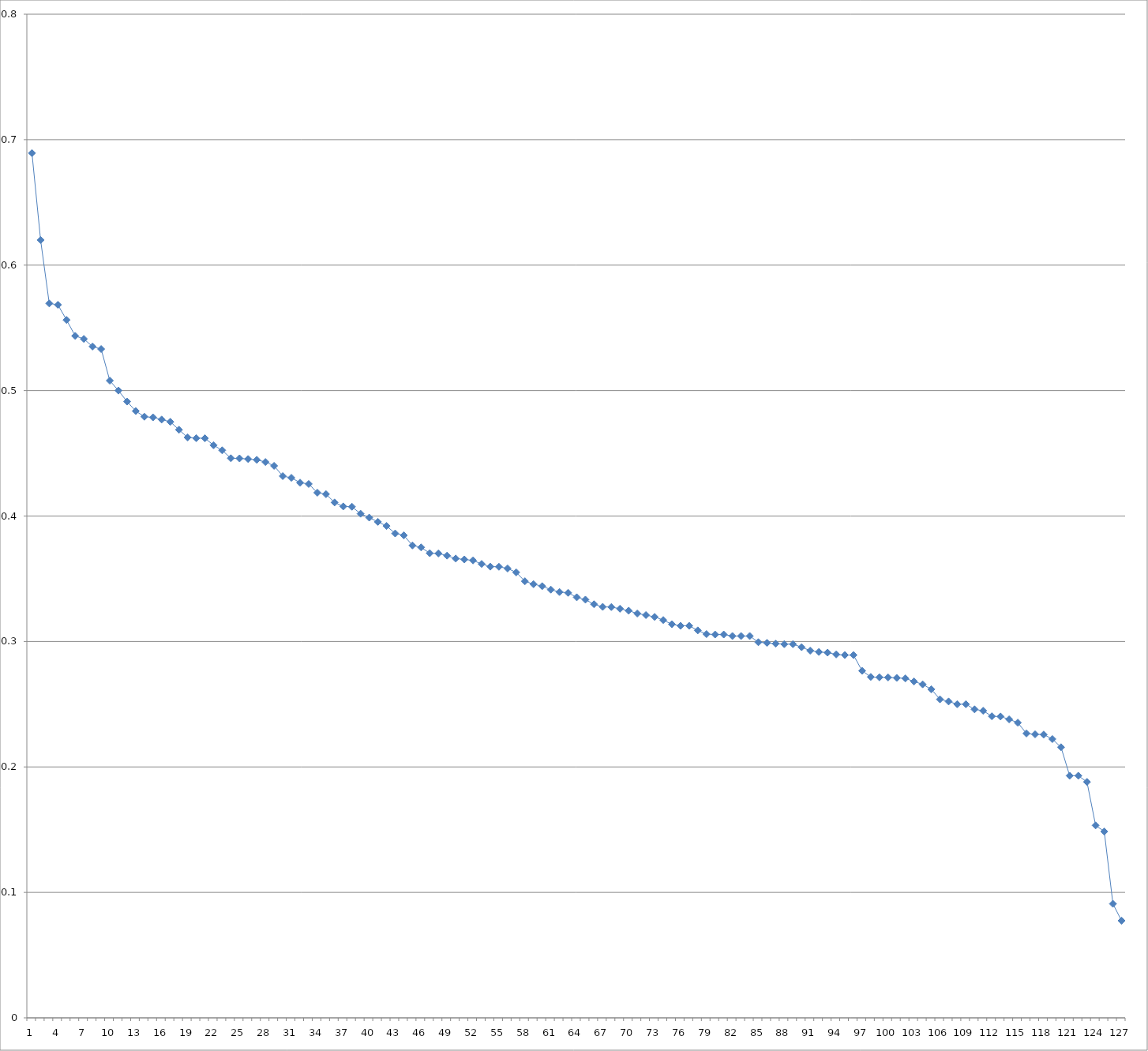
| Category | Series 0 |
|---|---|
| 0 | 0.689 |
| 1 | 0.62 |
| 2 | 0.569 |
| 3 | 0.568 |
| 4 | 0.556 |
| 5 | 0.544 |
| 6 | 0.541 |
| 7 | 0.535 |
| 8 | 0.533 |
| 9 | 0.508 |
| 10 | 0.5 |
| 11 | 0.491 |
| 12 | 0.484 |
| 13 | 0.479 |
| 14 | 0.479 |
| 15 | 0.477 |
| 16 | 0.475 |
| 17 | 0.469 |
| 18 | 0.463 |
| 19 | 0.462 |
| 20 | 0.462 |
| 21 | 0.456 |
| 22 | 0.452 |
| 23 | 0.446 |
| 24 | 0.446 |
| 25 | 0.445 |
| 26 | 0.445 |
| 27 | 0.443 |
| 28 | 0.44 |
| 29 | 0.432 |
| 30 | 0.43 |
| 31 | 0.427 |
| 32 | 0.426 |
| 33 | 0.419 |
| 34 | 0.417 |
| 35 | 0.411 |
| 36 | 0.408 |
| 37 | 0.407 |
| 38 | 0.402 |
| 39 | 0.399 |
| 40 | 0.395 |
| 41 | 0.392 |
| 42 | 0.386 |
| 43 | 0.385 |
| 44 | 0.377 |
| 45 | 0.375 |
| 46 | 0.37 |
| 47 | 0.37 |
| 48 | 0.368 |
| 49 | 0.366 |
| 50 | 0.365 |
| 51 | 0.365 |
| 52 | 0.362 |
| 53 | 0.36 |
| 54 | 0.36 |
| 55 | 0.358 |
| 56 | 0.355 |
| 57 | 0.348 |
| 58 | 0.346 |
| 59 | 0.344 |
| 60 | 0.341 |
| 61 | 0.339 |
| 62 | 0.339 |
| 63 | 0.335 |
| 64 | 0.333 |
| 65 | 0.33 |
| 66 | 0.328 |
| 67 | 0.327 |
| 68 | 0.326 |
| 69 | 0.325 |
| 70 | 0.322 |
| 71 | 0.321 |
| 72 | 0.32 |
| 73 | 0.317 |
| 74 | 0.314 |
| 75 | 0.312 |
| 76 | 0.312 |
| 77 | 0.309 |
| 78 | 0.306 |
| 79 | 0.306 |
| 80 | 0.306 |
| 81 | 0.304 |
| 82 | 0.304 |
| 83 | 0.304 |
| 84 | 0.299 |
| 85 | 0.299 |
| 86 | 0.298 |
| 87 | 0.298 |
| 88 | 0.298 |
| 89 | 0.295 |
| 90 | 0.293 |
| 91 | 0.292 |
| 92 | 0.291 |
| 93 | 0.29 |
| 94 | 0.289 |
| 95 | 0.289 |
| 96 | 0.277 |
| 97 | 0.272 |
| 98 | 0.271 |
| 99 | 0.271 |
| 100 | 0.271 |
| 101 | 0.271 |
| 102 | 0.268 |
| 103 | 0.266 |
| 104 | 0.262 |
| 105 | 0.254 |
| 106 | 0.252 |
| 107 | 0.25 |
| 108 | 0.25 |
| 109 | 0.246 |
| 110 | 0.245 |
| 111 | 0.24 |
| 112 | 0.24 |
| 113 | 0.238 |
| 114 | 0.235 |
| 115 | 0.227 |
| 116 | 0.226 |
| 117 | 0.226 |
| 118 | 0.222 |
| 119 | 0.216 |
| 120 | 0.193 |
| 121 | 0.193 |
| 122 | 0.188 |
| 123 | 0.153 |
| 124 | 0.149 |
| 125 | 0.091 |
| 126 | 0.077 |